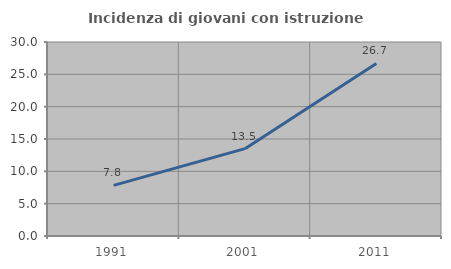
| Category | Incidenza di giovani con istruzione universitaria |
|---|---|
| 1991.0 | 7.831 |
| 2001.0 | 13.506 |
| 2011.0 | 26.692 |